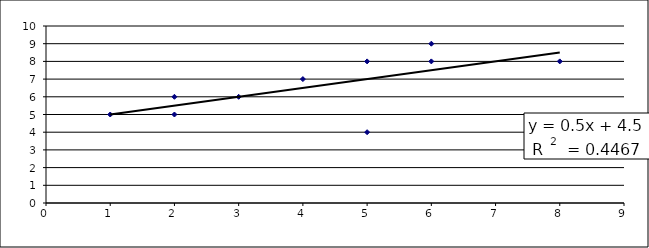
| Category | Yi |
|---|---|
| 4.0 | 7 |
| 1.0 | 5 |
| 2.0 | 5 |
| 2.0 | 6 |
| 3.0 | 6 |
| 5.0 | 4 |
| 5.0 | 8 |
| 6.0 | 8 |
| 6.0 | 9 |
| 8.0 | 8 |